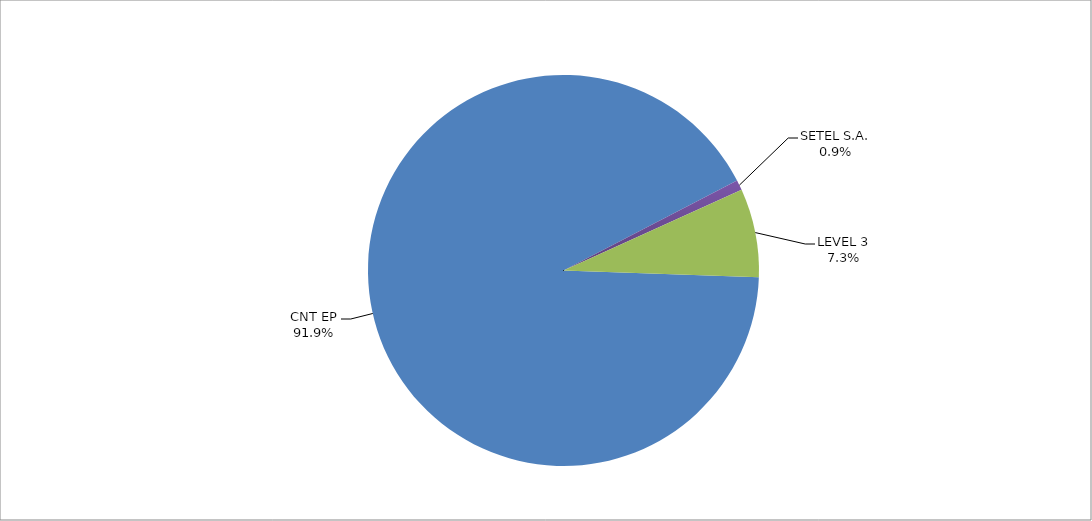
| Category | Series 0 |
|---|---|
| CNT EP | 326 |
| SETEL S.A. | 3 |
| LEVEL 3 | 26 |